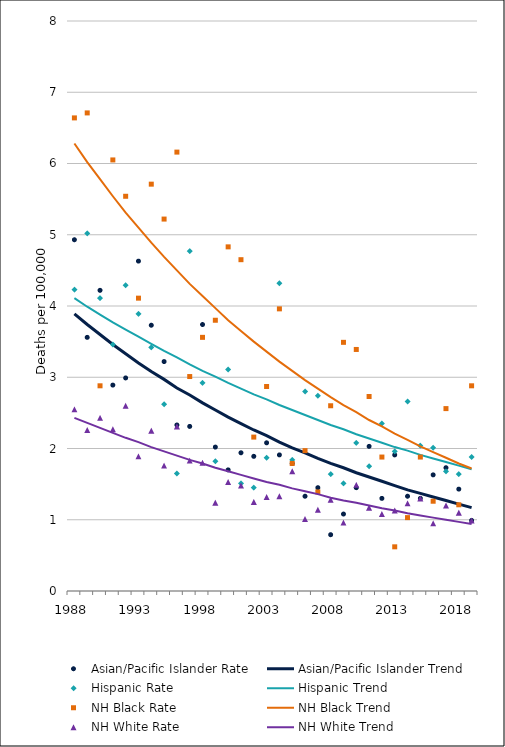
| Category | Asian/Pacific Islander Rate | Asian/Pacific Islander Trend | Hispanic Rate | Hispanic Trend | NH Black Rate | NH Black Trend | NH White Rate | NH White Trend |
|---|---|---|---|---|---|---|---|---|
| 1988.0 | 4.93 | 3.89 | 4.23 | 4.11 | 6.64 | 6.28 | 2.55 | 2.43 |
| 1989.0 | 3.56 | 3.74 | 5.02 | 3.99 | 6.71 | 6.02 | 2.26 | 2.36 |
| 1990.0 | 4.22 | 3.6 | 4.11 | 3.88 | 2.88 | 5.78 | 2.43 | 2.29 |
| 1991.0 | 2.89 | 3.46 | 3.46 | 3.77 | 6.05 | 5.54 | 2.27 | 2.22 |
| 1992.0 | 2.99 | 3.33 | 4.29 | 3.67 | 5.54 | 5.31 | 2.6 | 2.15 |
| 1993.0 | 4.63 | 3.2 | 3.89 | 3.57 | 4.11 | 5.1 | 1.89 | 2.09 |
| 1994.0 | 3.73 | 3.08 | 3.42 | 3.47 | 5.71 | 4.89 | 2.25 | 2.02 |
| 1995.0 | 3.22 | 2.97 | 2.62 | 3.37 | 5.22 | 4.69 | 1.76 | 1.96 |
| 1996.0 | 2.33 | 2.85 | 1.65 | 3.28 | 6.16 | 4.5 | 2.31 | 1.9 |
| 1997.0 | 2.31 | 2.75 | 4.77 | 3.18 | 3.01 | 4.31 | 1.83 | 1.84 |
| 1998.0 | 3.74 | 2.64 | 2.92 | 3.09 | 3.56 | 4.14 | 1.8 | 1.79 |
| 1999.0 | 2.02 | 2.54 | 1.82 | 3.01 | 3.8 | 3.97 | 1.24 | 1.73 |
| 2000.0 | 1.7 | 2.44 | 3.11 | 2.92 | 4.83 | 3.8 | 1.53 | 1.68 |
| 2001.0 | 1.94 | 2.35 | 1.51 | 2.84 | 4.65 | 3.65 | 1.48 | 1.63 |
| 2002.0 | 1.89 | 2.26 | 1.45 | 2.76 | 2.16 | 3.5 | 1.25 | 1.58 |
| 2003.0 | 2.08 | 2.18 | 1.87 | 2.69 | 2.87 | 3.36 | 1.32 | 1.53 |
| 2004.0 | 1.91 | 2.09 | 4.32 | 2.61 | 3.96 | 3.22 | 1.33 | 1.49 |
| 2005.0 | 1.79 | 2.01 | 1.84 | 2.54 | 1.79 | 3.09 | 1.68 | 1.44 |
| 2006.0 | 1.33 | 1.94 | 2.8 | 2.47 | 1.97 | 2.96 | 1.01 | 1.4 |
| 2007.0 | 1.45 | 1.86 | 2.74 | 2.4 | 1.39 | 2.84 | 1.14 | 1.36 |
| 2008.0 | 0.79 | 1.79 | 1.64 | 2.33 | 2.6 | 2.72 | 1.28 | 1.31 |
| 2009.0 | 1.08 | 1.73 | 1.51 | 2.27 | 3.49 | 2.61 | 0.96 | 1.27 |
| 2010.0 | 1.45 | 1.66 | 2.08 | 2.2 | 3.39 | 2.51 | 1.49 | 1.24 |
| 2011.0 | 2.03 | 1.6 | 1.75 | 2.14 | 2.73 | 2.4 | 1.17 | 1.2 |
| 2012.0 | 1.3 | 1.54 | 2.35 | 2.08 | 1.88 | 2.31 | 1.08 | 1.16 |
| 2013.0 | 1.91 | 1.48 | 1.96 | 2.02 | 0.62 | 2.21 | 1.13 | 1.13 |
| 2014.0 | 1.33 | 1.42 | 2.66 | 1.97 | 1.03 | 2.12 | 1.23 | 1.09 |
| 2015.0 | 1.3 | 1.37 | 2.04 | 1.91 | 1.88 | 2.03 | 1.3 | 1.06 |
| 2016.0 | 1.63 | 1.32 | 2.01 | 1.86 | 1.26 | 1.95 | 0.95 | 1.03 |
| 2017.0 | 1.73 | 1.27 | 1.68 | 1.81 | 2.56 | 1.87 | 1.2 | 1 |
| 2018.0 | 1.43 | 1.22 | 1.64 | 1.76 | 1.21 | 1.79 | 1.1 | 0.97 |
| 2019.0 | 0.99 | 1.17 | 1.88 | 1.71 | 2.88 | 1.72 | 0.99 | 0.94 |